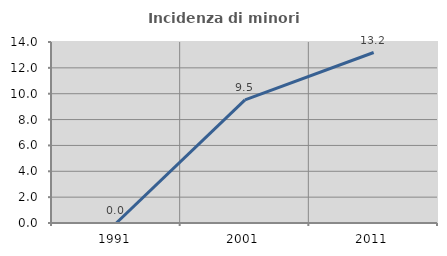
| Category | Incidenza di minori stranieri |
|---|---|
| 1991.0 | 0 |
| 2001.0 | 9.524 |
| 2011.0 | 13.187 |